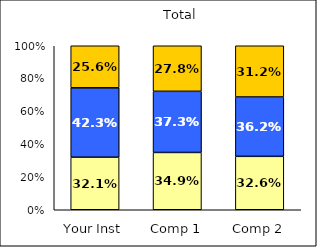
| Category | Low Likelihood of College Involvement | Average Likelihood of College Involvement | High Likelihood of College Involvement |
|---|---|---|---|
| Your Inst | 0.321 | 0.423 | 0.256 |
| Comp 1 | 0.349 | 0.373 | 0.278 |
| Comp 2 | 0.326 | 0.362 | 0.312 |